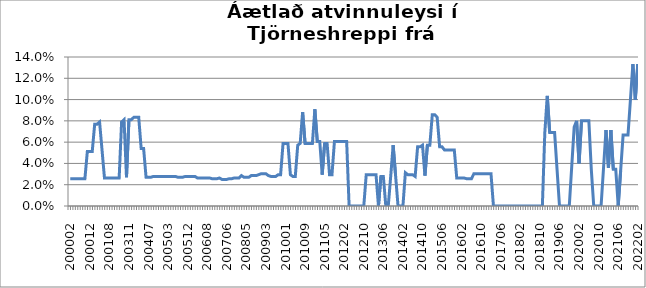
| Category | Series 0 |
|---|---|
| 200002 | 0.026 |
| 200003 | 0.026 |
| 200004 | 0.026 |
| 200005 | 0.026 |
| 200008 | 0.026 |
| 200009 | 0.026 |
| 200010 | 0.026 |
| 200011 | 0.051 |
| 200012 | 0.051 |
| 200101 | 0.051 |
| 200102 | 0.077 |
| 200103 | 0.077 |
| 200104 | 0.079 |
| 200105 | 0.053 |
| 200106 | 0.026 |
| 200107 | 0.026 |
| 200108 | 0.026 |
| 200110 | 0.026 |
| 200111 | 0.026 |
| 200201 | 0.026 |
| 200202 | 0.026 |
| 200302 | 0.079 |
| 200303 | 0.081 |
| 200307 | 0.027 |
| 200311 | 0.081 |
| 200312 | 0.081 |
| 200401 | 0.083 |
| 200402 | 0.083 |
| 200403 | 0.083 |
| 200404 | 0.054 |
| 200405 | 0.054 |
| 200406 | 0.027 |
| 200407 | 0.027 |
| 200408 | 0.027 |
| 200409 | 0.028 |
| 200410 | 0.028 |
| 200411 | 0.028 |
| 200412 | 0.028 |
| 200501 | 0.028 |
| 200502 | 0.028 |
| 200503 | 0.028 |
| 200504 | 0.028 |
| 200505 | 0.028 |
| 200506 | 0.028 |
| 200507 | 0.027 |
| 200508 | 0.027 |
| 200509 | 0.027 |
| 200510 | 0.028 |
| 200512 | 0.028 |
| 200601 | 0.028 |
| 200602 | 0.028 |
| 200603 | 0.028 |
| 200604 | 0.026 |
| 200605 | 0.026 |
| 200606 | 0.026 |
| 200607 | 0.026 |
| 200608 | 0.026 |
| 200609 | 0.026 |
| 200610 | 0.026 |
| 200611 | 0.026 |
| 200612 | 0.026 |
| 200703 | 0.026 |
| 200704 | 0.025 |
| 200705 | 0.025 |
| 200706 | 0.025 |
| 200707 | 0.026 |
| 200709 | 0.026 |
| 200710 | 0.026 |
| 200711 | 0.026 |
| 200801 | 0.026 |
| 200803 | 0.029 |
| 200804 | 0.027 |
| 200805 | 0.027 |
| 200806 | 0.027 |
| 200807 | 0.029 |
| 200808 | 0.029 |
| 200809 | 0.029 |
| 200810 | 0.029 |
| 200901 | 0.03 |
| 200902 | 0.03 |
| 200903 | 0.03 |
| 200905 | 0.029 |
| 200907 | 0.028 |
| 200908 | 0.028 |
| 200909 | 0.028 |
| 200910 | 0.029 |
| 200911 | 0.029 |
| 200912 | 0.059 |
| 201001 | 0.059 |
| 201002 | 0.059 |
| 201003 | 0.029 |
| 201004 | 0.028 |
| 201005 | 0.028 |
| 201006 | 0.057 |
| 201007 | 0.059 |
| 201008 | 0.088 |
| 201009 | 0.059 |
| 201010 | 0.059 |
| 201011 | 0.059 |
| 201012 | 0.059 |
| 201101 | 0.091 |
| 201102 | 0.061 |
| 201103 | 0.061 |
| 201104 | 0.029 |
| 201105 | 0.059 |
| 201106 | 0.059 |
| 201107 | 0.029 |
| 201108 | 0.029 |
| 201110 | 0.061 |
| 201111 | 0.061 |
| 201112 | 0.061 |
| 201201 | 0.061 |
| 201202 | 0.061 |
| 201203 | 0.061 |
| 201204 | 0 |
| 201205 | 0 |
| 201206 | 0 |
| 201207 | 0 |
| 201208 | 0 |
| 201209 | 0 |
| 201210 | 0 |
| 201211 | 0.029 |
| 201212 | 0.029 |
| 201301 | 0.029 |
| 201302 | 0.029 |
| 201303 | 0.029 |
| 201304 | 0 |
| 201305 | 0.028 |
| 201306 | 0.028 |
| 201307 | 0 |
| 201308 | 0 |
| 201309 | 0.028 |
| 201310 | 0.057 |
| 201311 | 0.029 |
| 201312 | 0 |
| 201401 | 0 |
| 201402 | 0 |
| 201403 | 0.031 |
| 201404 | 0.029 |
| 201405 | 0.029 |
| 201406 | 0.029 |
| 201407 | 0.028 |
| 201408 | 0.056 |
| 201409 | 0.056 |
| 201410 | 0.057 |
| 201411 | 0.029 |
| 201412 | 0.057 |
| 201501 | 0.057 |
| 201502 | 0.086 |
| 201503 | 0.086 |
| 201504 | 0.083 |
| 201505 | 0.056 |
| 201506 | 0.056 |
| 201507 | 0.053 |
| 201508 | 0.053 |
| 201509 | 0.053 |
| 201510 | 0.053 |
| 201511 | 0.053 |
| 201512 | 0.026 |
| 201601 | 0.026 |
| 201602 | 0.026 |
| 201603 | 0.026 |
| 201604 | 0.026 |
| 201605 | 0.026 |
| 201606 | 0.026 |
| 201607 | 0.03 |
| 201608 | 0.03 |
| 201609 | 0.03 |
| 201610 | 0.03 |
| 201611 | 0.03 |
| 201612 | 0.03 |
| 201701 | 0.03 |
| 201702 | 0.03 |
| 201703 | 0 |
| 201704 | 0 |
| 201705 | 0 |
| 201706 | 0 |
| 201707 | 0 |
| 201708 | 0 |
| 201709 | 0 |
| 201710 | 0 |
| 201711 | 0 |
| 201712 | 0 |
| 201801 | 0 |
| 201802 | 0 |
| 201803 | 0 |
| 201804 | 0 |
| 201805 | 0 |
| 201806 | 0 |
| 201807 | 0 |
| 201808 | 0 |
| 201809 | 0 |
| 201810 | 0 |
| 201811 | 0 |
| 201812 | 0.069 |
| 201901 | 0.103 |
| 201902 | 0.069 |
| 201903 | 0.069 |
| 201904 | 0.069 |
| 201905 | 0.034 |
| 201906 | 0 |
| 201907 | 0 |
| 201908 | 0 |
| 201909 | 0 |
| 201910 | 0 |
| 201911 | 0.037 |
| 201912 | 0.074 |
| 202001 | 0.08 |
| 202002 | 0.04 |
| 202003 | 0.08 |
| 202004 | 0.08 |
| 202005 | 0.08 |
| 202006 | 0.08 |
| 202007 | 0.034 |
| 202008 | 0 |
| 202009 | 0 |
| 202010 | 0 |
| 202011 | 0 |
| 202012 | 0.036 |
| 202101 | 0.071 |
| 202102 | 0.036 |
| 202103 | 0.071 |
| 202104 | 0.034 |
| 202105 | 0.034 |
| 202106 | 0 |
| 202107 | 0.033 |
| 202108 | 0.067 |
| 202109 | 0.067 |
| 202110 | 0.067 |
| 202111 | 0.1 |
| 202111 | 0.133 |
| 202201 | 0.1 |
| 202202 | 0.133 |